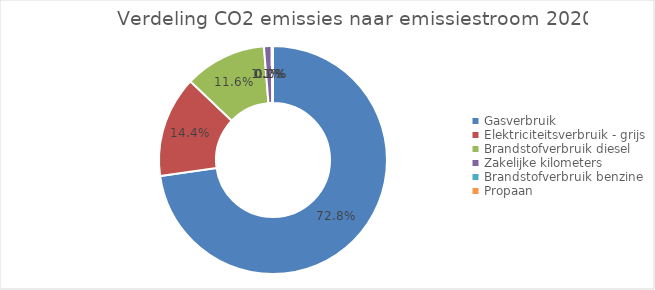
| Category | categorie |
|---|---|
| Gasverbruik | 2554.853 |
| Elektriciteitsverbruik - grijs | 504.308 |
| Brandstofverbruik diesel | 407.925 |
| Zakelijke kilometers | 37.887 |
| Brandstofverbruik benzine | 6.233 |
| Propaan | 0.436 |